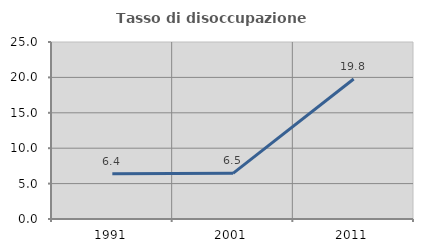
| Category | Tasso di disoccupazione giovanile  |
|---|---|
| 1991.0 | 6.383 |
| 2001.0 | 6.452 |
| 2011.0 | 19.78 |